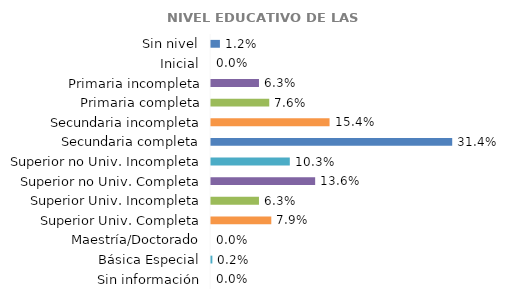
| Category | Series 0 |
|---|---|
| Sin nivel | 0.012 |
| Inicial | 0 |
| Primaria incompleta | 0.062 |
| Primaria completa | 0.076 |
| Secundaria incompleta | 0.154 |
| Secundaria completa | 0.314 |
| Superior no Univ. Incompleta | 0.103 |
| Superior no Univ. Completa | 0.136 |
| Superior Univ. Incompleta | 0.062 |
| Superior Univ. Completa | 0.079 |
| Maestría/Doctorado | 0 |
| Básica Especial | 0.002 |
| Sin información | 0 |